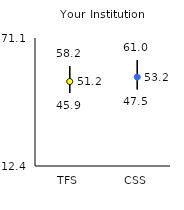
| Category | 25th | 75th | Mean |
|---|---|---|---|
| TFS | 45.9 | 58.2 | 51.15 |
| CSS | 47.5 | 61 | 53.18 |